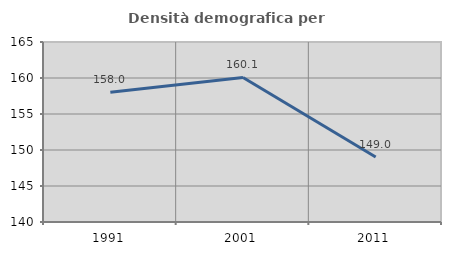
| Category | Densità demografica |
|---|---|
| 1991.0 | 158.022 |
| 2001.0 | 160.079 |
| 2011.0 | 149.039 |